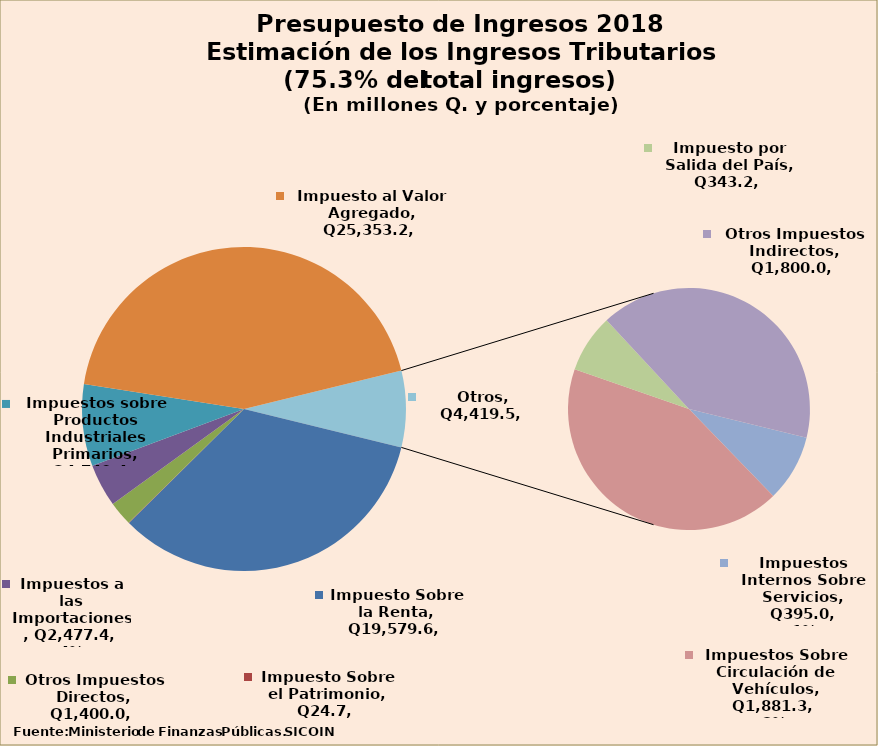
| Category | Aprobado 2017 |
|---|---|
| Impuesto Sobre la Renta | 19579.6 |
| Impuesto Sobre el Patrimonio | 24.7 |
| Otros Impuestos Directos | 1400 |
| Impuestos a las Importaciones | 2477.4 |
| Impuestos sobre Productos Industriales Primarios | 4740.4 |
| Impuesto al Valor Agregado | 25353.2 |
| Impuestos Internos Sobre Servicios | 395 |
| Impuestos Sobre Circulación de Vehículos | 1881.3 |
| Impuesto por Salida del País | 343.2 |
| Otros Impuestos Indirectos | 1800 |